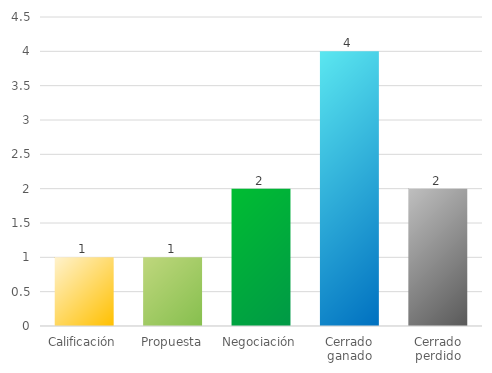
| Category | Series 0 |
|---|---|
| Calificación | 1 |
| Propuesta | 1 |
| Negociación | 2 |
| Cerrado ganado | 4 |
| Cerrado perdido | 2 |